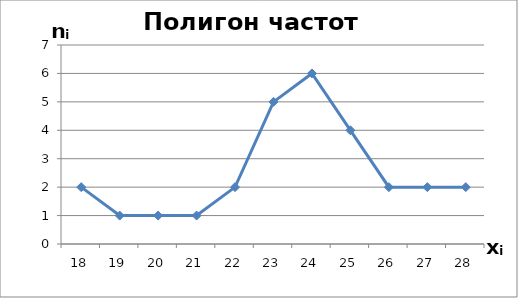
| Category | Series 0 |
|---|---|
| 18.0 | 2 |
| 19.0 | 1 |
| 20.0 | 1 |
| 21.0 | 1 |
| 22.0 | 2 |
| 23.0 | 5 |
| 24.0 | 6 |
| 25.0 | 4 |
| 26.0 | 2 |
| 27.0 | 2 |
| 28.0 | 2 |